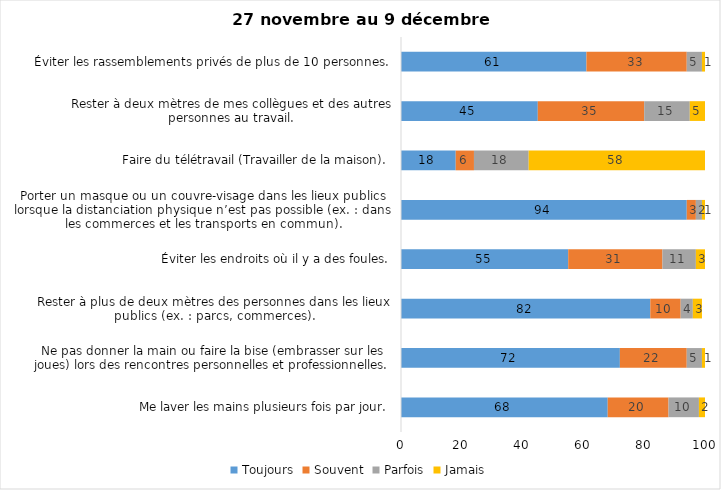
| Category | Toujours | Souvent | Parfois | Jamais |
|---|---|---|---|---|
| Me laver les mains plusieurs fois par jour. | 68 | 20 | 10 | 2 |
| Ne pas donner la main ou faire la bise (embrasser sur les joues) lors des rencontres personnelles et professionnelles. | 72 | 22 | 5 | 1 |
| Rester à plus de deux mètres des personnes dans les lieux publics (ex. : parcs, commerces). | 82 | 10 | 4 | 3 |
| Éviter les endroits où il y a des foules. | 55 | 31 | 11 | 3 |
| Porter un masque ou un couvre-visage dans les lieux publics lorsque la distanciation physique n’est pas possible (ex. : dans les commerces et les transports en commun). | 94 | 3 | 2 | 1 |
| Faire du télétravail (Travailler de la maison). | 18 | 6 | 18 | 58 |
| Rester à deux mètres de mes collègues et des autres personnes au travail. | 45 | 35 | 15 | 5 |
| Éviter les rassemblements privés de plus de 10 personnes. | 61 | 33 | 5 | 1 |